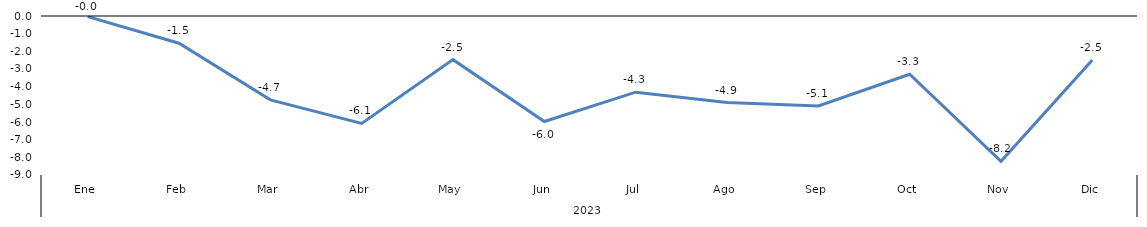
| Category | Bogotá |
|---|---|
| 0 | -0.036 |
| 1 | -1.54 |
| 2 | -4.748 |
| 3 | -6.083 |
| 4 | -2.47 |
| 5 | -5.973 |
| 6 | -4.311 |
| 7 | -4.898 |
| 8 | -5.089 |
| 9 | -3.298 |
| 10 | -8.228 |
| 11 | -2.492 |